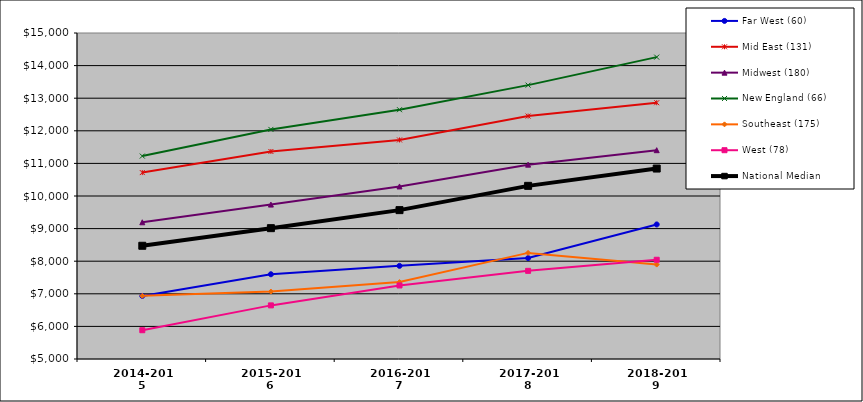
| Category | Far West (60) | Mid East (131) | Midwest (180) | New England (66) | Southeast (175) | West (78) | National Median |
|---|---|---|---|---|---|---|---|
| 2014-2015 | 6934.225 | 10718.351 | 9194.093 | 11225.021 | 6939.406 | 5882.501 | 8473.314 |
| 2015-2016 | 7599.589 | 11365.449 | 9736.636 | 12042.436 | 7068.79 | 6644.568 | 9013.486 |
| 2016-2017 | 7857.12 | 11719.588 | 10292.931 | 12646.754 | 7359.41 | 7255.571 | 9566.64 |
| 2017-2018 | 8095.67 | 12452.21 | 10961.812 | 13400.748 | 8254.784 | 7704.307 | 10311.147 |
| 2018-2019 | 9127.004 | 12861.193 | 11405.384 | 14260.061 | 7896.345 | 8044.239 | 10842.044 |